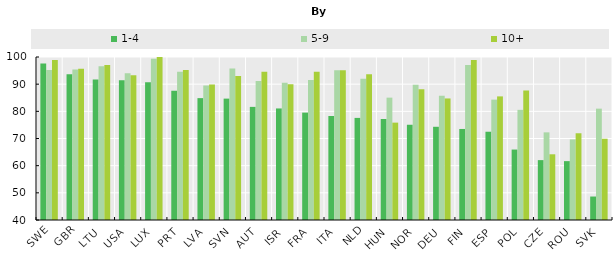
| Category | 1-4 | 5-9 | 10+ |
|---|---|---|---|
| SWE | 97.61 | 95.22 | 98.91 |
| GBR | 93.64 | 95.4 | 95.69 |
| LTU | 91.71 | 96.6 | 97.1 |
| USA | 91.488 | 94.004 | 93.316 |
| LUX | 90.68 | 99.35 | 100 |
| PRT | 87.62 | 94.61 | 95.2 |
| LVA | 84.86 | 89.47 | 89.84 |
| SVN | 84.68 | 95.74 | 93.02 |
| AUT | 81.64 | 91.18 | 94.54 |
| ISR | 81.062 | 90.503 | 89.988 |
| FRA | 79.53 | 91.5 | 94.59 |
| ITA | 78.29 | 95.1 | 95.13 |
| NLD | 77.58 | 91.98 | 93.67 |
| HUN | 77.17 | 85.04 | 75.84 |
| NOR | 75.06 | 89.83 | 88.09 |
| DEU | 74.31 | 85.74 | 84.74 |
| FIN | 73.51 | 97.1 | 98.91 |
| ESP | 72.49 | 84.31 | 85.5 |
| POL | 65.93 | 80.55 | 87.67 |
| CZE | 62.04 | 72.26 | 64.19 |
| ROU | 61.67 | 69.66 | 71.93 |
| SVK | 48.64 | 80.99 | 69.92 |